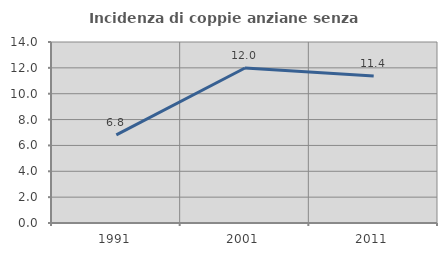
| Category | Incidenza di coppie anziane senza figli  |
|---|---|
| 1991.0 | 6.815 |
| 2001.0 | 11.989 |
| 2011.0 | 11.372 |